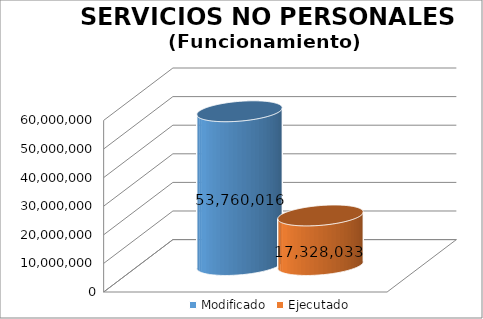
| Category | Modificado | Ejecutado |
|---|---|---|
| 0 | 53760016 | 17328032.63 |